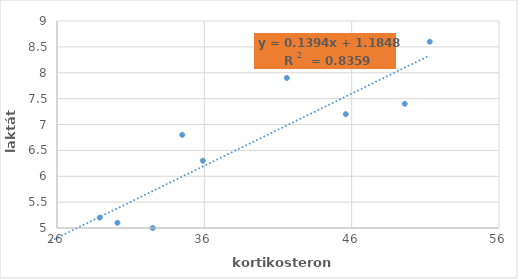
| Category | laktát (mmol/l) |
|---|---|
| 25.6 | 4.7 |
| 35.9 | 6.3 |
| 41.6 | 7.9 |
| 28.9 | 5.2 |
| 30.1 | 5.1 |
| 34.5 | 6.8 |
| 51.3 | 8.6 |
| 49.6 | 7.4 |
| 32.5 | 5 |
| 45.6 | 7.2 |